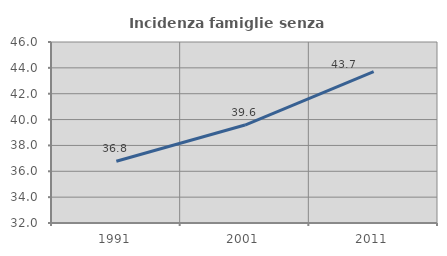
| Category | Incidenza famiglie senza nuclei |
|---|---|
| 1991.0 | 36.774 |
| 2001.0 | 39.576 |
| 2011.0 | 43.7 |